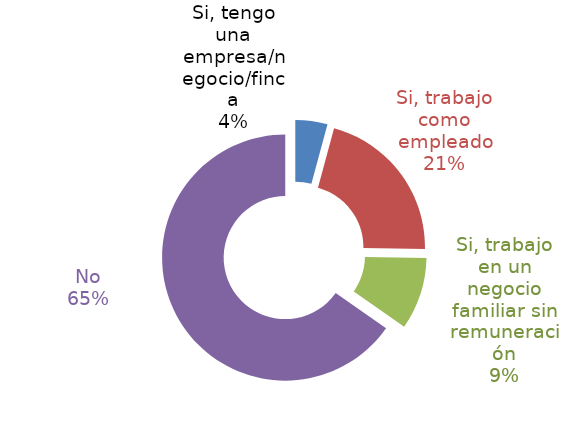
| Category | Series 0 |
|---|---|
| Si, tengo una empresa/negocio/finca | 0.036 |
| Si, trabajo como empleado | 0.178 |
| Si, trabajo en un negocio familiar sin remuneración | 0.08 |
| No | 0.551 |